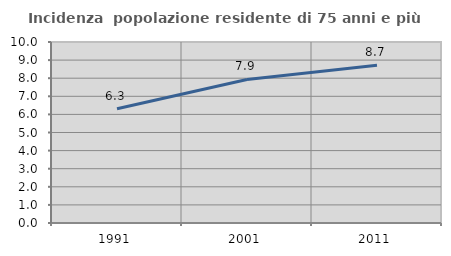
| Category | Incidenza  popolazione residente di 75 anni e più |
|---|---|
| 1991.0 | 6.315 |
| 2001.0 | 7.93 |
| 2011.0 | 8.712 |